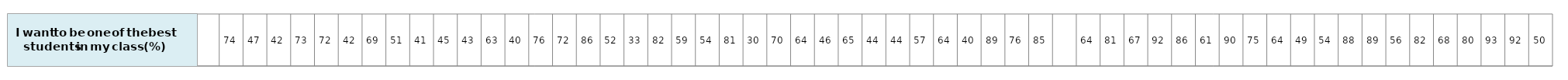
| Category | I want to be one of the best students in my class |
|---|---|
| nan | 1 |
| 74.23571563 | 1 |
| 46.75579362 | 1 |
| 41.51822734 | 1 |
| 73.10035737 | 1 |
| 72.02126729 | 1 |
| 41.6598488 | 1 |
| 69.17342455 | 1 |
| 51.140503460000005 | 1 |
| 40.78386174 | 1 |
| 44.77364616 | 1 |
| 42.69442128 | 1 |
| 63.35842942000001 | 1 |
| 40.37484958 | 1 |
| 75.52859125 | 1 |
| 72.39323335 | 1 |
| 86.35278101 | 1 |
| 51.98051756 | 1 |
| 32.867750459999996 | 1 |
| 81.90862383000001 | 1 |
| 58.624891680000005 | 1 |
| 53.78851858 | 1 |
| 81.24317056 | 1 |
| 29.738676632 | 1 |
| 69.97604386 | 1 |
| 64.29789152000001 | 1 |
| 46.40788235 | 1 |
| 65.49381479 | 1 |
| 44.47532207 | 1 |
| 44.30826031 | 1 |
| 57.43366041 | 1 |
| 63.6484409 | 1 |
| 39.98597352 | 1 |
| 89.25623283 | 1 |
| 75.56559752 | 1 |
| 85.38135084999999 | 1 |
| nan | 1 |
| 63.931933580000006 | 1 |
| 81.12107773 | 1 |
| 67.22305951999999 | 1 |
| 91.63727524 | 1 |
| 85.54470715 | 1 |
| 61.4606841 | 1 |
| 90.37619227 | 1 |
| 75.40071802 | 1 |
| 63.51579228 | 1 |
| 48.59766787 | 1 |
| 54.370426480000006 | 1 |
| 88.4144328 | 1 |
| 89.42908616 | 1 |
| 55.77054098 | 1 |
| 82.25161338999999 | 1 |
| 68.0454029 | 1 |
| 79.72059809999999 | 1 |
| 93.05518523 | 1 |
| 91.54205242 | 1 |
| 49.922060169999995 | 1 |